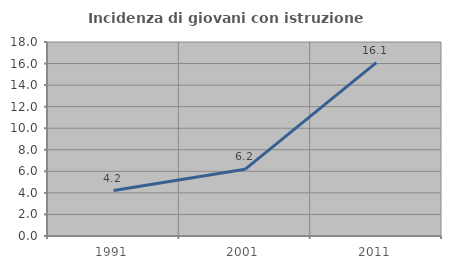
| Category | Incidenza di giovani con istruzione universitaria |
|---|---|
| 1991.0 | 4.212 |
| 2001.0 | 6.188 |
| 2011.0 | 16.084 |